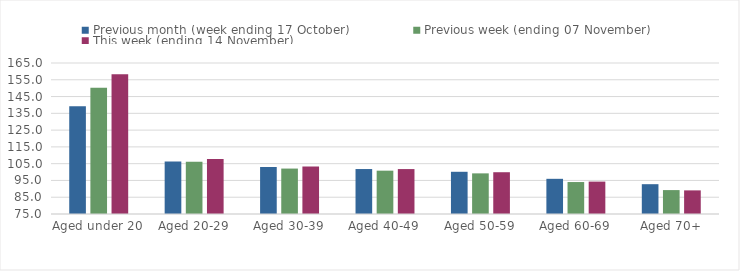
| Category | Previous month (week ending 17 October) | Previous week (ending 07 November) | This week (ending 14 November) |
|---|---|---|---|
| Aged under 20 | 139.27 | 150.21 | 158.26 |
| Aged 20-29 | 106.26 | 106.21 | 107.71 |
| Aged 30-39 | 103.03 | 102.08 | 103.31 |
| Aged 40-49 | 101.8 | 100.83 | 101.78 |
| Aged 50-59 | 100.16 | 99.22 | 99.9 |
| Aged 60-69 | 95.97 | 94.05 | 94.31 |
| Aged 70+ | 92.77 | 89.25 | 89.08 |